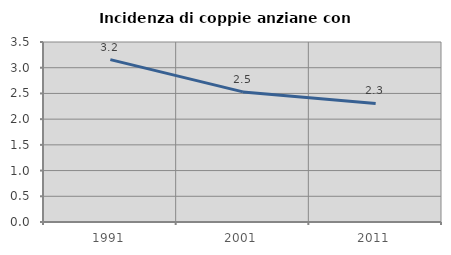
| Category | Incidenza di coppie anziane con figli |
|---|---|
| 1991.0 | 3.158 |
| 2001.0 | 2.53 |
| 2011.0 | 2.305 |